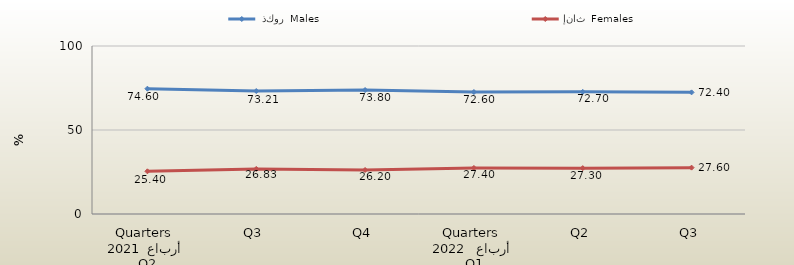
| Category |  ذكور  Males | إناث  Females |
|---|---|---|
| 0 | 74.599 | 25.401 |
| 1 | 73.206 | 26.833 |
| 2 | 73.8 | 26.2 |
| 3 | 72.6 | 27.4 |
| 4 | 72.7 | 27.3 |
| 5 | 72.4 | 27.6 |